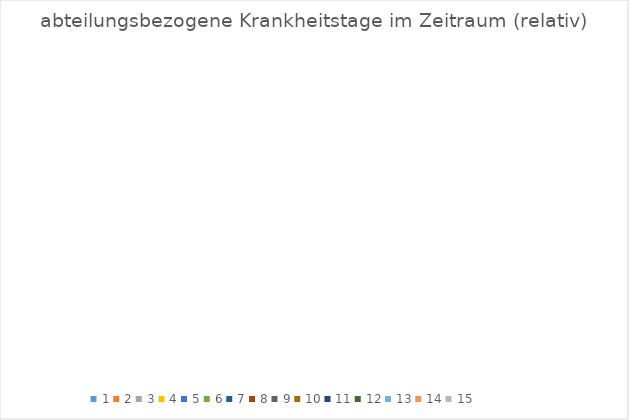
| Category | Gesamt (relativ) |
|---|---|
| 0 | 0 |
| 1 | 0 |
| 2 | 0 |
| 3 | 0 |
| 4 | 0 |
| 5 | 0 |
| 6 | 0 |
| 7 | 0 |
| 8 | 0 |
| 9 | 0 |
| 10 | 0 |
| 11 | 0 |
| 12 | 0 |
| 13 | 0 |
| 14 | 0 |